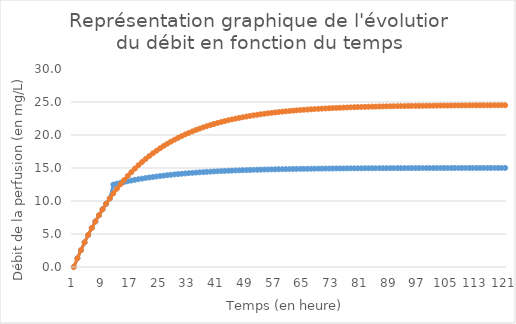
| Category | Series 0 | Series 1 |
|---|---|---|
| 0 | 0 | 0 |
| 1 | 1.314 | 1.314 |
| 2 | 2.557 | 2.557 |
| 3 | 3.734 | 3.734 |
| 4 | 4.847 | 4.847 |
| 5 | 5.901 | 5.901 |
| 6 | 6.899 | 6.899 |
| 7 | 7.843 | 7.843 |
| 8 | 8.737 | 8.737 |
| 9 | 9.583 | 9.583 |
| 10 | 10.384 | 10.384 |
| 11 | 12.494 | 11.142 |
| 12 | 12.629 | 11.859 |
| 13 | 12.757 | 12.538 |
| 14 | 12.877 | 13.181 |
| 15 | 12.992 | 13.789 |
| 16 | 13.1 | 14.364 |
| 17 | 13.202 | 14.909 |
| 18 | 13.299 | 15.425 |
| 19 | 13.391 | 15.913 |
| 20 | 13.478 | 16.375 |
| 21 | 13.56 | 16.812 |
| 22 | 13.638 | 17.226 |
| 23 | 13.711 | 17.618 |
| 24 | 13.781 | 17.988 |
| 25 | 13.847 | 18.339 |
| 26 | 13.91 | 18.672 |
| 27 | 13.969 | 18.986 |
| 28 | 14.025 | 19.283 |
| 29 | 14.077 | 19.565 |
| 30 | 14.128 | 19.832 |
| 31 | 14.175 | 20.084 |
| 32 | 14.22 | 20.323 |
| 33 | 14.262 | 20.549 |
| 34 | 14.303 | 20.762 |
| 35 | 14.341 | 20.965 |
| 36 | 14.377 | 21.156 |
| 37 | 14.411 | 21.338 |
| 38 | 14.443 | 21.509 |
| 39 | 14.474 | 21.672 |
| 40 | 14.502 | 21.826 |
| 41 | 14.53 | 21.971 |
| 42 | 14.556 | 22.109 |
| 43 | 14.58 | 22.239 |
| 44 | 14.603 | 22.363 |
| 45 | 14.625 | 22.48 |
| 46 | 14.646 | 22.59 |
| 47 | 14.666 | 22.695 |
| 48 | 14.684 | 22.794 |
| 49 | 14.702 | 22.888 |
| 50 | 14.719 | 22.976 |
| 51 | 14.734 | 23.06 |
| 52 | 14.749 | 23.14 |
| 53 | 14.764 | 23.215 |
| 54 | 14.777 | 23.286 |
| 55 | 14.79 | 23.354 |
| 56 | 14.802 | 23.417 |
| 57 | 14.813 | 23.478 |
| 58 | 14.824 | 23.535 |
| 59 | 14.834 | 23.589 |
| 60 | 14.843 | 23.64 |
| 61 | 14.853 | 23.689 |
| 62 | 14.861 | 23.734 |
| 63 | 14.869 | 23.778 |
| 64 | 14.877 | 23.819 |
| 65 | 14.884 | 23.858 |
| 66 | 14.891 | 23.895 |
| 67 | 14.898 | 23.929 |
| 68 | 14.904 | 23.962 |
| 69 | 14.91 | 23.994 |
| 70 | 14.915 | 24.023 |
| 71 | 14.921 | 24.051 |
| 72 | 14.926 | 24.078 |
| 73 | 14.93 | 24.103 |
| 74 | 14.935 | 24.126 |
| 75 | 14.939 | 24.149 |
| 76 | 14.943 | 24.17 |
| 77 | 14.947 | 24.19 |
| 78 | 14.95 | 24.209 |
| 79 | 14.954 | 24.227 |
| 80 | 14.957 | 24.244 |
| 81 | 14.96 | 24.26 |
| 82 | 14.963 | 24.275 |
| 83 | 14.966 | 24.29 |
| 84 | 14.968 | 24.304 |
| 85 | 14.971 | 24.317 |
| 86 | 14.973 | 24.329 |
| 87 | 14.975 | 24.34 |
| 88 | 14.977 | 24.351 |
| 89 | 14.979 | 24.362 |
| 90 | 14.981 | 24.372 |
| 91 | 14.983 | 24.381 |
| 92 | 14.984 | 24.39 |
| 93 | 14.986 | 24.398 |
| 94 | 14.987 | 24.406 |
| 95 | 14.989 | 24.413 |
| 96 | 14.99 | 24.42 |
| 97 | 14.991 | 24.427 |
| 98 | 14.993 | 24.433 |
| 99 | 14.994 | 24.439 |
| 100 | 14.995 | 24.445 |
| 101 | 14.996 | 24.451 |
| 102 | 14.997 | 24.456 |
| 103 | 14.998 | 24.46 |
| 104 | 14.999 | 24.465 |
| 105 | 14.999 | 24.469 |
| 106 | 15 | 24.473 |
| 107 | 15.001 | 24.477 |
| 108 | 15.001 | 24.481 |
| 109 | 15.002 | 24.484 |
| 110 | 15.003 | 24.488 |
| 111 | 15.003 | 24.491 |
| 112 | 15.004 | 24.494 |
| 113 | 15.004 | 24.496 |
| 114 | 15.005 | 24.499 |
| 115 | 15.005 | 24.501 |
| 116 | 15.006 | 24.504 |
| 117 | 15.006 | 24.506 |
| 118 | 15.007 | 24.508 |
| 119 | 15.007 | 24.51 |
| 120 | 15.007 | 24.512 |